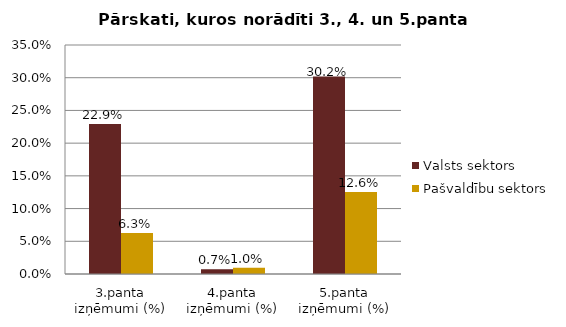
| Category | Valsts sektors | Pašvaldību sektors |
|---|---|---|
| 3.panta izņēmumi (%) | 0.229 | 0.063 |
| 4.panta izņēmumi (%) | 0.007 | 0.01 |
| 5.panta izņēmumi (%) | 0.302 | 0.126 |